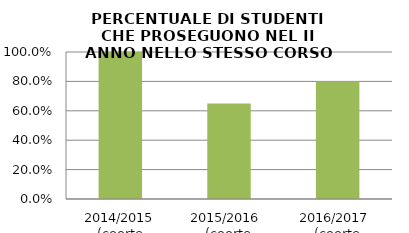
| Category | 2014/2015 (coorte 2013/14) 2015/2016  (coorte 2014/15) 2016/2017  (coorte 2015/16) |
|---|---|
| 2014/2015 (coorte 2013/14) | 1 |
| 2015/2016  (coorte 2014/15) | 0.65 |
| 2016/2017  (coorte 2015/16) | 0.8 |